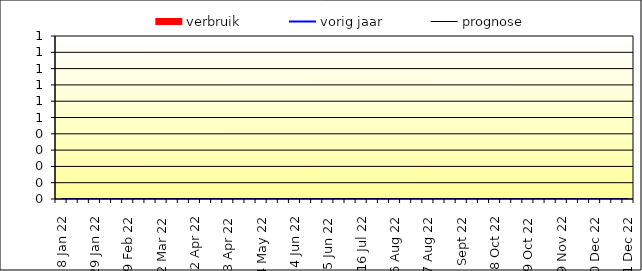
| Category | verbruik |
|---|---|
| 2022-01-08 | 0 |
| 2022-01-15 | 0 |
| 2022-01-22 | 0 |
| 2022-01-29 | 0 |
| 2022-02-05 | 0 |
| 2022-02-12 | 0 |
| 2022-02-19 | 0 |
| 2022-02-26 | 0 |
| 2022-03-05 | 0 |
| 2022-03-12 | 0 |
| 2022-03-19 | 0 |
| 2022-03-26 | 0 |
| 2022-04-02 | 0 |
| 2022-04-09 | 0 |
| 2022-04-16 | 0 |
| 2022-04-23 | 0 |
| 2022-04-30 | 0 |
| 2022-05-07 | 0 |
| 2022-05-14 | 0 |
| 2022-05-21 | 0 |
| 2022-05-28 | 0 |
| 2022-06-04 | 0 |
| 2022-06-11 | 0 |
| 2022-06-18 | 0 |
| 2022-06-25 | 0 |
| 2022-07-02 | 0 |
| 2022-07-09 | 0 |
| 2022-07-16 | 0 |
| 2022-07-23 | 0 |
| 2022-07-30 | 0 |
| 2022-08-06 | 0 |
| 2022-08-13 | 0 |
| 2022-08-20 | 0 |
| 2022-08-27 | 0 |
| 2022-09-03 | 0 |
| 2022-09-10 | 0 |
| 2022-09-17 | 0 |
| 2022-09-24 | 0 |
| 2022-10-01 | 0 |
| 2022-10-08 | 0 |
| 2022-10-15 | 0 |
| 2022-10-22 | 0 |
| 2022-10-29 | 0 |
| 2022-11-05 | 0 |
| 2022-11-12 | 0 |
| 2022-11-19 | 0 |
| 2022-11-26 | 0 |
| 2022-12-03 | 0 |
| 2022-12-10 | 0 |
| 2022-12-17 | 0 |
| 2022-12-24 | 0 |
| 2022-12-31 | 0 |